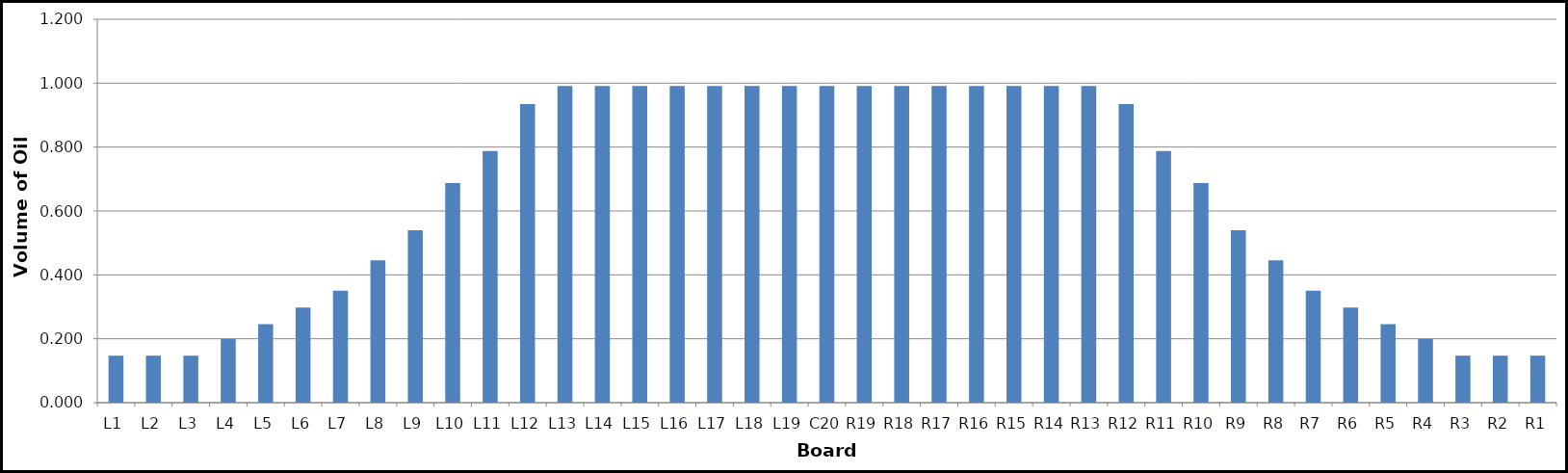
| Category | Series 0 |
|---|---|
| L1 | 0.147 |
| L2 | 0.147 |
| L3 | 0.147 |
| L4 | 0.199 |
| L5 | 0.246 |
| L6 | 0.297 |
| L7 | 0.351 |
| L8 | 0.445 |
| L9 | 0.539 |
| L10 | 0.687 |
| L11 | 0.788 |
| L12 | 0.935 |
| L13 | 0.991 |
| L14 | 0.991 |
| L15 | 0.991 |
| L16 | 0.991 |
| L17 | 0.991 |
| L18 | 0.991 |
| L19 | 0.991 |
| C20 | 0.991 |
| R19 | 0.991 |
| R18 | 0.991 |
| R17 | 0.991 |
| R16 | 0.991 |
| R15 | 0.991 |
| R14 | 0.991 |
| R13 | 0.991 |
| R12 | 0.935 |
| R11 | 0.788 |
| R10 | 0.687 |
| R9 | 0.539 |
| R8 | 0.445 |
| R7 | 0.351 |
| R6 | 0.297 |
| R5 | 0.246 |
| R4 | 0.199 |
| R3 | 0.147 |
| R2 | 0.147 |
| R1 | 0.147 |